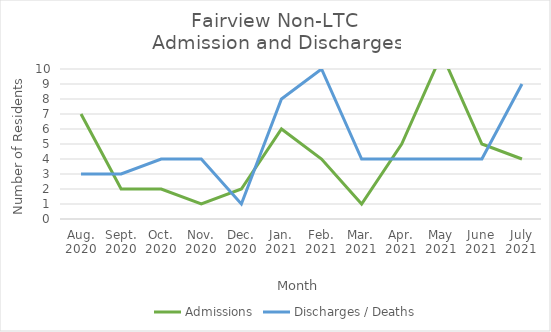
| Category | Admissions | Discharges / Deaths |
|---|---|---|
| Aug.
2020 | 7 | 3 |
| Sept.
2020 | 2 | 3 |
| Oct.
2020 | 2 | 4 |
| Nov.
2020 | 1 | 4 |
| Dec.
2020 | 2 | 1 |
| Jan.
2021 | 6 | 8 |
| Feb.
2021 | 4 | 10 |
| Mar.
2021 | 1 | 4 |
| Apr.
2021 | 5 | 4 |
| May
2021 | 11 | 4 |
| June
2021 | 5 | 4 |
| July
2021 | 4 | 9 |